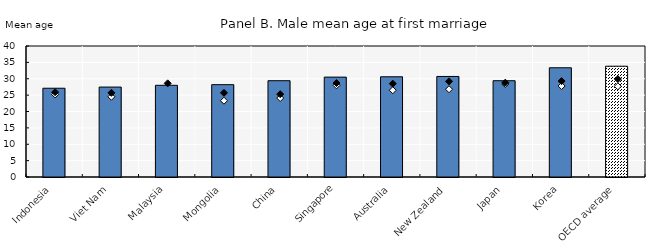
| Category | 2021 |
|---|---|
| Indonesia | 27.1 |
| Viet Nam | 27.46 |
| Malaysia | 28 |
| Mongolia | 28.2 |
| China | 29.4 |
| Singapore | 30.5 |
| Australia | 30.6 |
| New Zealand | 30.7 |
| Japan | 29.4 |
| Korea | 33.35 |
| OECD average | 33.825 |